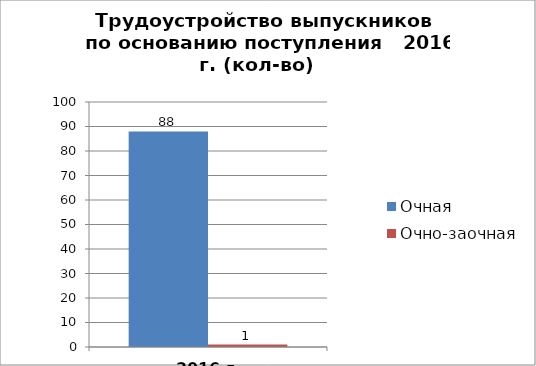
| Category | Очная | Очно-заочная |
|---|---|---|
| 2016 г. | 88 | 1 |